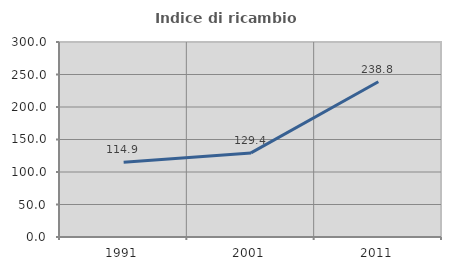
| Category | Indice di ricambio occupazionale  |
|---|---|
| 1991.0 | 114.884 |
| 2001.0 | 129.396 |
| 2011.0 | 238.828 |